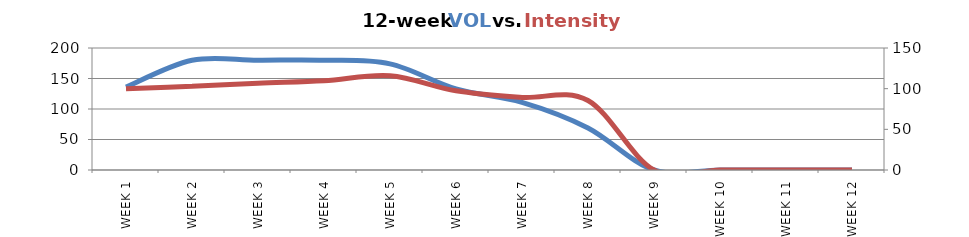
| Category | NL |
|---|---|
| WEEK 1 | 136 |
| WEEK 2 | 180 |
| WEEK 3 | 180 |
| WEEK 4 | 180 |
| WEEK 5 | 174 |
| WEEK 6 | 133 |
| WEEK 7 | 111 |
| WEEK 8 | 69 |
| WEEK 9 | 0 |
| WEEK 10 | 0 |
| WEEK 11 | 0 |
| WEEK 12 | 0 |